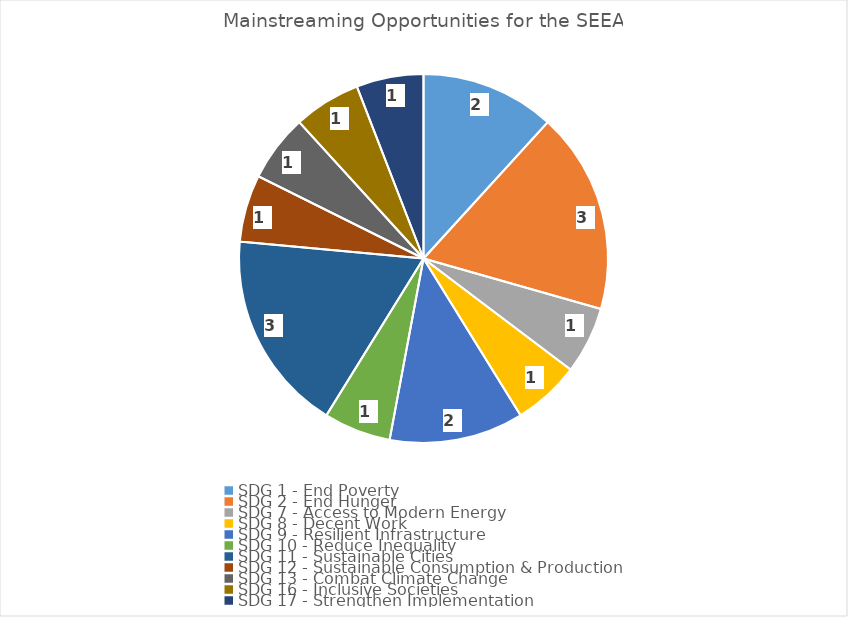
| Category | Series 0 |
|---|---|
| SDG 1 - End Poverty | 2 |
| SDG 2 - End Hunger | 3 |
| SDG 7 - Access to Modern Energy | 1 |
| SDG 8 - Decent Work | 1 |
| SDG 9 - Resilient Infrastructure | 2 |
| SDG 10 - Reduce Inequality | 1 |
| SDG 11 - Sustainable Cities | 3 |
| SDG 12 - Sustainable Consumption & Production | 1 |
| SDG 13 - Combat Climate Change | 1 |
| SDG 16 - Inclusive Societies | 1 |
| SDG 17 - Strengthen Implementation | 1 |